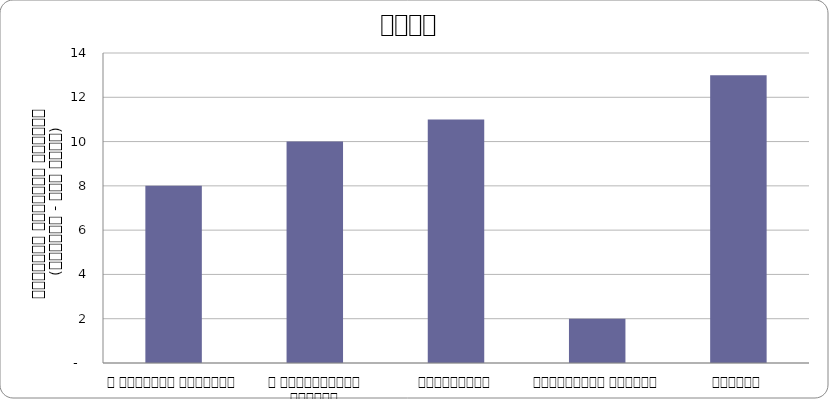
| Category | शासन |
|---|---|
| द हिमालयन टाइम्स् | 8 |
| द काठमाण्डौं पोस्ट् | 10 |
| कान्तिपुर | 11 |
| अन्नपूर्ण पोस्ट् | 2 |
| नागरिक | 13 |